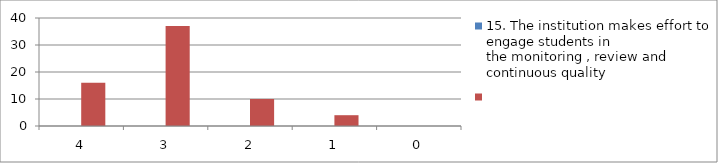
| Category | 15. The institution makes effort to engage students in
the monitoring , review and continuous quality | Series 1 |
|---|---|---|
| 4.0 | 0 | 16 |
| 3.0 | 0 | 37 |
| 2.0 | 0 | 10 |
| 1.0 | 0 | 4 |
| 0.0 | 0 | 0 |